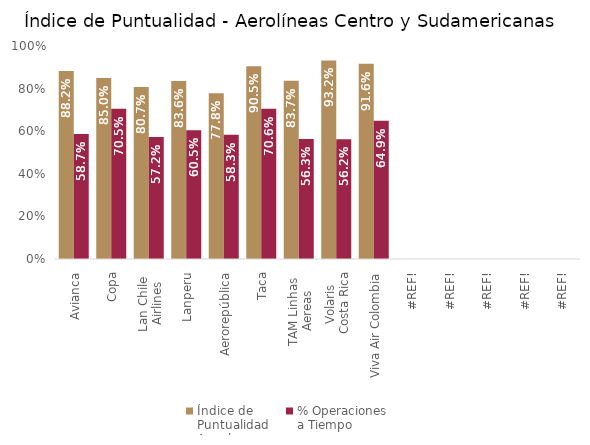
| Category | Índice de 
Puntualidad
Anual | % Operaciones 
a Tiempo |
|---|---|---|
| Avianca | 0.882 | 0.587 |
| Copa | 0.85 | 0.705 |
| Lan Chile 
Airlines | 0.807 | 0.572 |
| Lanperu | 0.836 | 0.605 |
| Aerorepública | 0.778 | 0.583 |
| Taca | 0.905 | 0.706 |
| TAM Linhas 
Aereas | 0.837 | 0.563 |
| Volaris 
Costa Rica | 0.932 | 0.562 |
| Viva Air Colombia | 0.916 | 0.649 |
| #¡REF! | 0 | 0 |
| #¡REF! | 0 | 0 |
| #¡REF! | 0 | 0 |
| #¡REF! | 0 | 0 |
| #¡REF! | 0 | 0 |